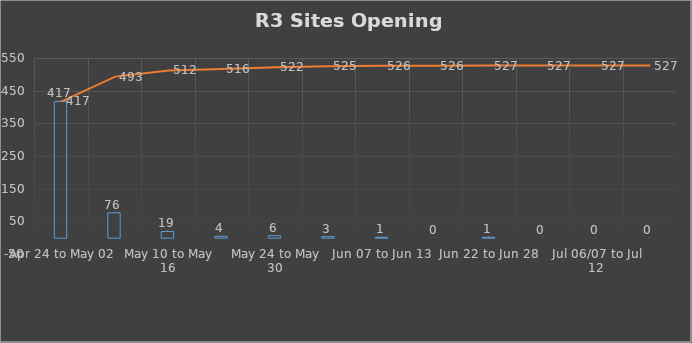
| Category | Sites opened in period |
|---|---|
| Apr 24 to May 02 | 417 |
| May 03 to May 09 | 76 |
| May 10 to May 16 | 19 |
| May 17 to May 23 | 4 |
| May 24 to May 30 | 6 |
| May 31 to Jun 06 | 3 |
| Jun 07 to Jun 13 | 1 |
| Jun 15 to Jun 21 | 0 |
| Jun 22 to Jun 28 | 1 |
| Jun 29 to Jul 05 | 0 |
| Jul 06/07 to Jul 12 | 0 |
| Jul 13 to Jul 19 | 0 |